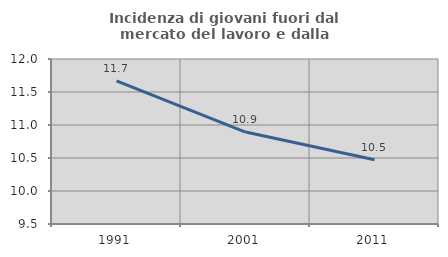
| Category | Incidenza di giovani fuori dal mercato del lavoro e dalla formazione  |
|---|---|
| 1991.0 | 11.67 |
| 2001.0 | 10.893 |
| 2011.0 | 10.472 |